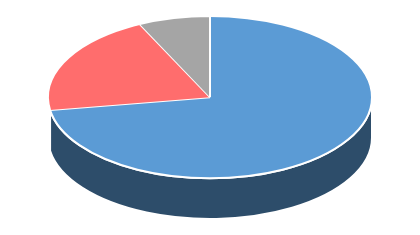
| Category | Series 0 |
|---|---|
| Sí | 0.724 |
| No | 0.204 |
| No responde | 0.071 |